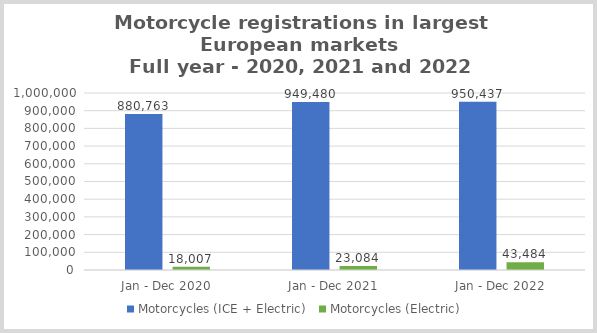
| Category | Motorcycles (ICE + Electric)  | Motorcycles (Electric)  |
|---|---|---|
| Jan - Dec 2020 | 880763 | 18007 |
| Jan - Dec 2021 | 949480 | 23084 |
| Jan - Dec 2022 | 950437 | 43484 |